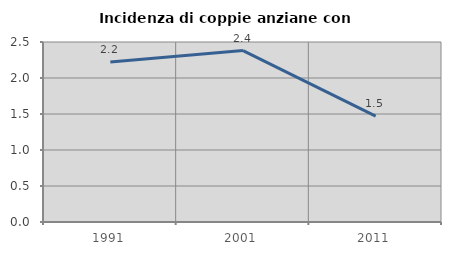
| Category | Incidenza di coppie anziane con figli |
|---|---|
| 1991.0 | 2.222 |
| 2001.0 | 2.381 |
| 2011.0 | 1.471 |